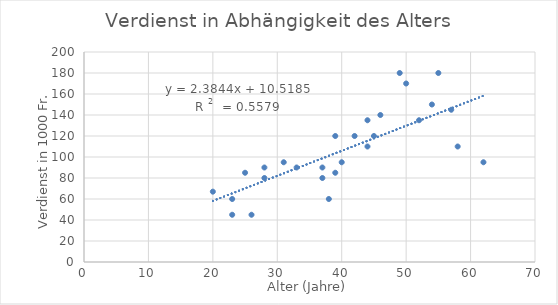
| Category | Series 0 |
|---|---|
| 20.0 | 67 |
| 23.0 | 45 |
| 23.0 | 60 |
| 25.0 | 85 |
| 26.0 | 45 |
| 28.0 | 90 |
| 28.0 | 80 |
| 31.0 | 95 |
| 33.0 | 90 |
| 37.0 | 90 |
| 37.0 | 80 |
| 38.0 | 60 |
| 39.0 | 120 |
| 39.0 | 85 |
| 40.0 | 95 |
| 42.0 | 120 |
| 44.0 | 135 |
| 44.0 | 110 |
| 45.0 | 120 |
| 46.0 | 140 |
| 49.0 | 180 |
| 50.0 | 170 |
| 52.0 | 135 |
| 54.0 | 150 |
| 55.0 | 180 |
| 57.0 | 145 |
| 58.0 | 110 |
| 62.0 | 95 |